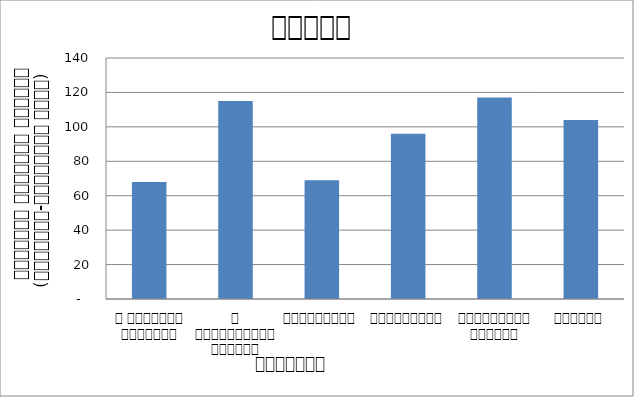
| Category | Total |
|---|---|
| द हिमालयन टाइम्स् | 68 |
| द काठमाण्डौं पोस्ट् | 115 |
| रिपब्लिका | 69 |
| कान्तिपुर | 96 |
| अन्नपूर्ण पोस्ट् | 117 |
| नागरिक | 104 |